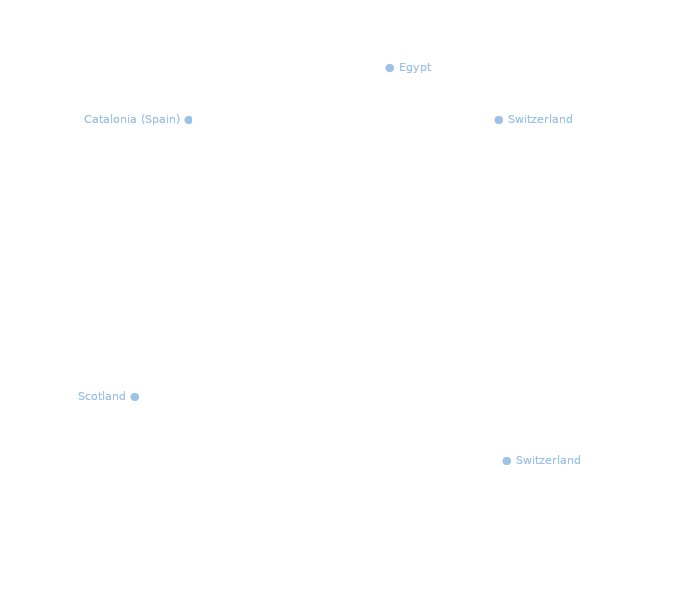
| Category | Dummy |
|---|---|
|  | 1 |
| ● Egypt | 1 |
|  | 1 |
|  | 1 |
|  | 1 |
|  | 1 |
|  | 1 |
|  | 1 |
|  | 1 |
|  | 1 |
|  | 1 |
|  | 1 |
|  | 1 |
|  | 1 |
|  | 1 |
| ● Switzerland | 1 |
|  | 1 |
|  | 1 |
|  | 1 |
|  | 1 |
|  | 1 |
|  | 1 |
|  | 1 |
|  | 1 |
|  | 1 |
|  | 1 |
|  | 1 |
|  | 1 |
|  | 1 |
|  | 1 |
|  | 1 |
|  | 1 |
|  | 1 |
|  | 1 |
|  | 1 |
|  | 1 |
|  | 1 |
|  | 1 |
|  | 1 |
|  | 1 |
|  | 1 |
|  | 1 |
|  | 1 |
|  | 1 |
|  | 1 |
|  | 1 |
|  | 1 |
|  | 1 |
|  | 1 |
| ● Switzerland | 1 |
|  | 1 |
|  | 1 |
|  | 1 |
|  | 1 |
|  | 1 |
|  | 1 |
|  | 1 |
|  | 1 |
|  | 1 |
|  | 1 |
|  | 1 |
|  | 1 |
|  | 1 |
|  | 1 |
|  | 1 |
|  | 1 |
|  | 1 |
|  | 1 |
|  | 1 |
|  | 1 |
|  | 1 |
|  | 1 |
|  | 1 |
|  | 1 |
|  | 1 |
|  | 1 |
|  | 1 |
|  | 1 |
|  | 1 |
|  | 1 |
|  | 1 |
|  | 1 |
|  | 1 |
|  | 1 |
|  | 1 |
|  | 1 |
|  | 1 |
|  | 1 |
|  | 1 |
| Scotland ● | 1 |
|  | 1 |
|  | 1 |
|  | 1 |
|  | 1 |
|  | 1 |
|  | 1 |
|  | 1 |
|  | 1 |
|  | 1 |
|  | 1 |
|  | 1 |
|  | 1 |
|  | 1 |
|  | 1 |
|  | 1 |
|  | 1 |
|  | 1 |
|  | 1 |
|  | 1 |
|  | 1 |
|  | 1 |
|  | 1 |
|  | 1 |
|  | 1 |
|  | 1 |
|  | 1 |
| Catalonia (Spain) ● | 1 |